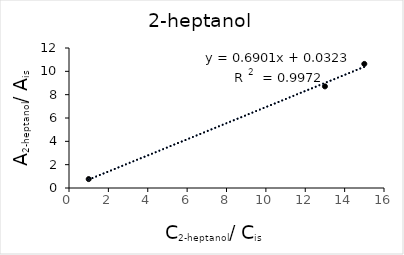
| Category | Series 0 |
|---|---|
| 1.0 | 0.764 |
| 13.0 | 8.71 |
| 15.0 | 10.636 |